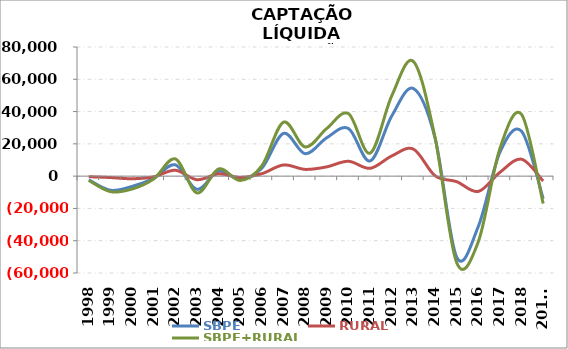
| Category | SBPE | RURAL | SBPE+RURAL |
|---|---|---|---|
| 1998 | -2301.5 | -361.228 | -2662.728 |
| 1999 | -8740.2 | -858.508 | -9598.708 |
| 2000 | -6355.964 | -1615.457 | -7971.421 |
| 2001 | -1319.381 | -412.963 | -1732.344 |
| 2002 | 7008.282 | 3649.972 | 10658.254 |
| 2003 | -8178.886 | -2213.868 | -10392.754 |
| 2004 | 3057.299 | 1425.147 | 4482.446 |
| 2005 | -1869.531 | -826.948 | -2696.479 |
| 2006 | 4963.736 | 1532.919 | 6496.655 |
| 2007 | 26493.6 | 6927.358 | 33420.958 |
| 2008 | 13900.71 | 4187.043 | 18087.753 |
| 2009 | 23813.033 | 5752.651 | 29565.684 |
| 2010 | 29513.472 | 9213.301 | 38726.773 |
| 2011 | 9382.932 | 4844.657 | 14227.589 |
| 2012 | 37239.575 | 12479.984 | 49719.559 |
| 2013 | 54280.749 | 16766.843 | 71047.592 |
| 2014 | 23758.558 | 275.423 | 24033.981 |
| 2015 | -50149.363 | -3418.504 | -53567.867 |
| 2016 | -31222.546 | -9479.207 | -40701.753 |
| 2017 | 14774.799 | 2351.903 | 17126.702 |
| 2018 | 27791.076 | 10469.293 | 38260.369 |
| 2019* | -13962.33 | -3034.8 | -16997.13 |